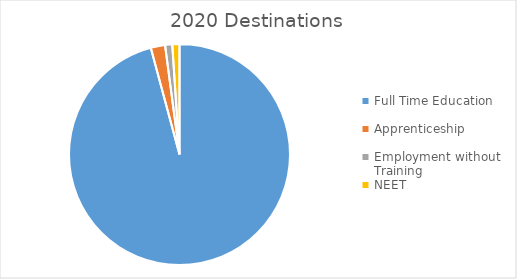
| Category | Series 0 |
|---|---|
| Full Time Education | 183 |
| Apprenticeship | 4 |
| Employment without Training | 2 |
| NEET | 2 |